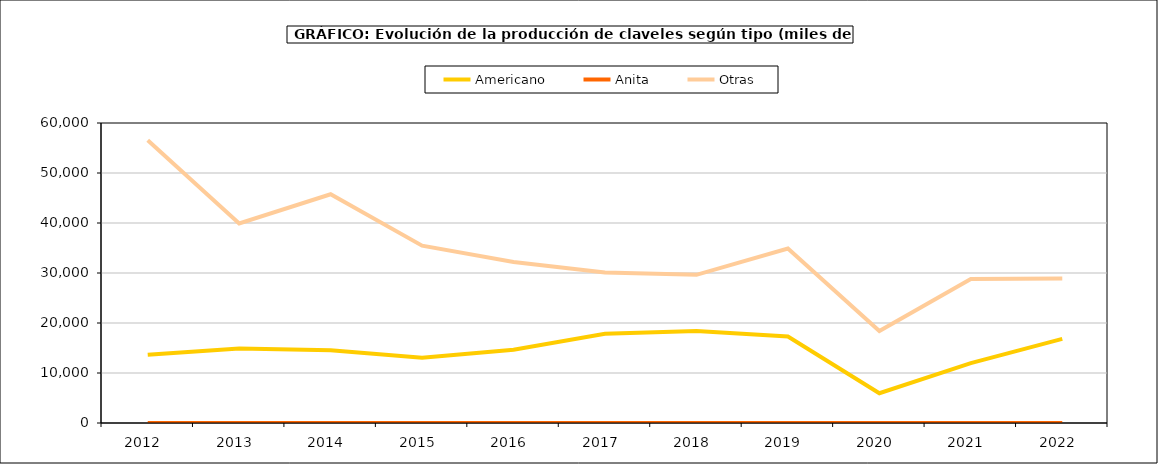
| Category | Americano | Anita | Otras |
|---|---|---|---|
| 2012.0 | 13658 | 0 | 56550 |
| 2013.0 | 14880 | 0 | 39920 |
| 2014.0 | 14528 | 0 | 45749 |
| 2015.0 | 13065 | 0 | 35460 |
| 2016.0 | 14654 | 0 | 32202 |
| 2017.0 | 17866 | 0 | 30124 |
| 2018.0 | 18413 | 0 | 29630 |
| 2019.0 | 17283 | 3 | 34898 |
| 2020.0 | 5959 | 7 | 18397 |
| 2021.0 | 11977 | 7 | 28805 |
| 2022.0 | 16816 | 7 | 28903 |